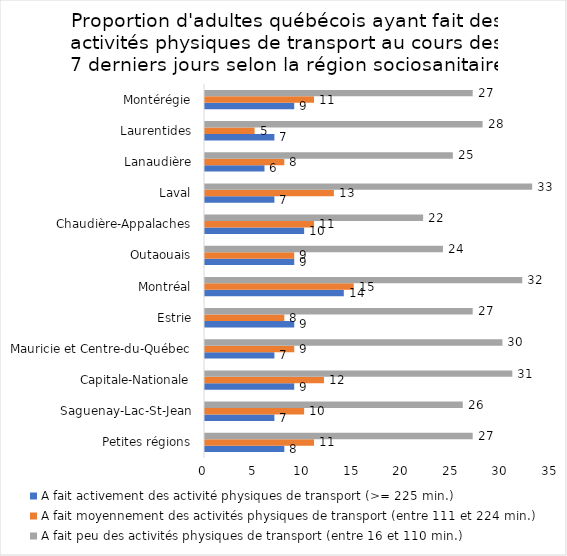
| Category | A fait activement des activité physiques de transport (>= 225 min.) | A fait moyennement des activités physiques de transport (entre 111 et 224 min.) | A fait peu des activités physiques de transport (entre 16 et 110 min.) |
|---|---|---|---|
| Petites régions | 8 | 11 | 27 |
| Saguenay-Lac-St-Jean | 7 | 10 | 26 |
| Capitale-Nationale | 9 | 12 | 31 |
| Mauricie et Centre-du-Québec | 7 | 9 | 30 |
| Estrie | 9 | 8 | 27 |
| Montréal | 14 | 15 | 32 |
| Outaouais | 9 | 9 | 24 |
| Chaudière-Appalaches | 10 | 11 | 22 |
| Laval | 7 | 13 | 33 |
| Lanaudière | 6 | 8 | 25 |
| Laurentides | 7 | 5 | 28 |
| Montérégie | 9 | 11 | 27 |